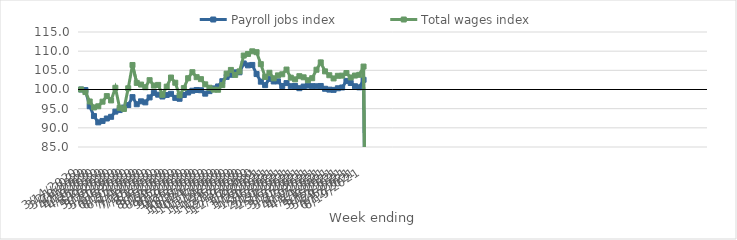
| Category | Payroll jobs index | Total wages index |
|---|---|---|
| 14/03/2020 | 100 | 100 |
| 21/03/2020 | 99.85 | 99.331 |
| 28/03/2020 | 95.633 | 96.872 |
| 04/04/2020 | 93.075 | 95.321 |
| 11/04/2020 | 91.426 | 95.621 |
| 18/04/2020 | 91.797 | 96.822 |
| 25/04/2020 | 92.432 | 98.281 |
| 02/05/2020 | 92.874 | 97.149 |
| 09/05/2020 | 94.231 | 100.441 |
| 16/05/2020 | 94.636 | 95.22 |
| 23/05/2020 | 95.289 | 94.915 |
| 30/05/2020 | 95.937 | 100.318 |
| 06/06/2020 | 98.011 | 106.391 |
| 13/06/2020 | 96.158 | 101.722 |
| 20/06/2020 | 96.912 | 101.29 |
| 27/06/2020 | 96.637 | 100.596 |
| 04/07/2020 | 97.932 | 102.437 |
| 11/07/2020 | 99.122 | 101.021 |
| 18/07/2020 | 98.648 | 101.2 |
| 25/07/2020 | 98.166 | 98.624 |
| 01/08/2020 | 98.576 | 100.743 |
| 08/08/2020 | 98.881 | 103.119 |
| 15/08/2020 | 97.814 | 101.763 |
| 22/08/2020 | 97.582 | 98.499 |
| 29/08/2020 | 98.564 | 100.36 |
| 05/09/2020 | 99.217 | 102.944 |
| 12/09/2020 | 99.679 | 104.511 |
| 19/09/2020 | 99.87 | 103.218 |
| 26/09/2020 | 99.806 | 102.702 |
| 03/10/2020 | 98.917 | 101.347 |
| 10/10/2020 | 99.573 | 100.454 |
| 17/10/2020 | 100.283 | 99.963 |
| 24/10/2020 | 100.798 | 99.933 |
| 31/10/2020 | 102.167 | 101.144 |
| 07/11/2020 | 103.285 | 104.142 |
| 14/11/2020 | 103.84 | 105.107 |
| 21/11/2020 | 104.474 | 103.802 |
| 28/11/2020 | 104.484 | 104.722 |
| 05/12/2020 | 106.791 | 108.853 |
| 12/12/2020 | 106.293 | 109.281 |
| 19/12/2020 | 106.405 | 109.959 |
| 26/12/2020 | 104.031 | 109.733 |
| 02/01/2021 | 102.038 | 106.609 |
| 09/01/2021 | 101.14 | 103.271 |
| 16/01/2021 | 102.79 | 104.364 |
| 23/01/2021 | 102.096 | 102.916 |
| 30/01/2021 | 102.13 | 103.682 |
| 06/02/2021 | 100.915 | 103.97 |
| 13/02/2021 | 101.673 | 105.203 |
| 20/02/2021 | 100.864 | 103.09 |
| 27/02/2021 | 100.918 | 102.646 |
| 06/03/2021 | 100.342 | 103.473 |
| 13/03/2021 | 100.768 | 103.179 |
| 20/03/2021 | 101.028 | 102.419 |
| 27/03/2021 | 100.873 | 102.949 |
| 03/04/2021 | 100.845 | 105.154 |
| 10/04/2021 | 100.918 | 107.071 |
| 17/04/2021 | 100.189 | 104.729 |
| 24/04/2021 | 99.97 | 103.719 |
| 01/05/2021 | 99.902 | 102.888 |
| 08/05/2021 | 100.32 | 103.578 |
| 15/05/2021 | 100.522 | 103.617 |
| 22/05/2021 | 102.235 | 104.3 |
| 29/05/2021 | 101.696 | 103.14 |
| 05/06/2021 | 100.849 | 103.64 |
| 12/06/2021 | 100.556 | 103.828 |
| 19/06/2021 | 102.53 | 105.985 |